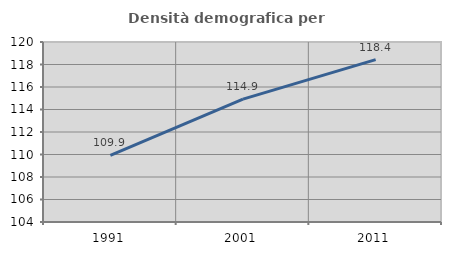
| Category | Densità demografica |
|---|---|
| 1991.0 | 109.93 |
| 2001.0 | 114.927 |
| 2011.0 | 118.434 |